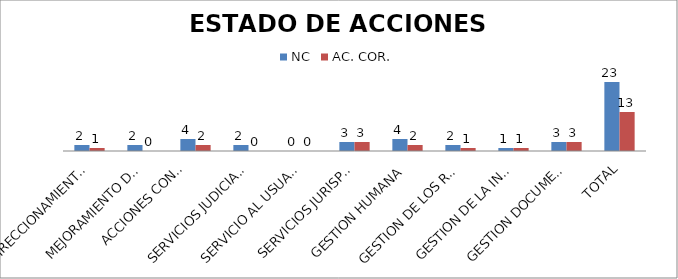
| Category | NC | AC. COR. |
|---|---|---|
| DIRECCIONAMIENTO DEL SGC | 2 | 1 |
| MEJORAMIENTO DE LA GESTION  | 2 | 0 |
| ACCIONES CONSTITUCIONALES
Y DISCIPLINARIAS | 4 | 2 |
| SERVICIOS JUDICIALES | 2 | 0 |
| SERVICIO AL USUARIO | 0 | 0 |
| SERVICIOS JURISPRUDENCIALES | 3 | 3 |
| GESTION HUMANA | 4 | 2 |
| GESTION DE LOS RECURSOS | 2 | 1 |
| GESTION DE LA INFORMACION | 1 | 1 |
| GESTION DOCUMENTAL | 3 | 3 |
| TOTAL | 23 | 13 |